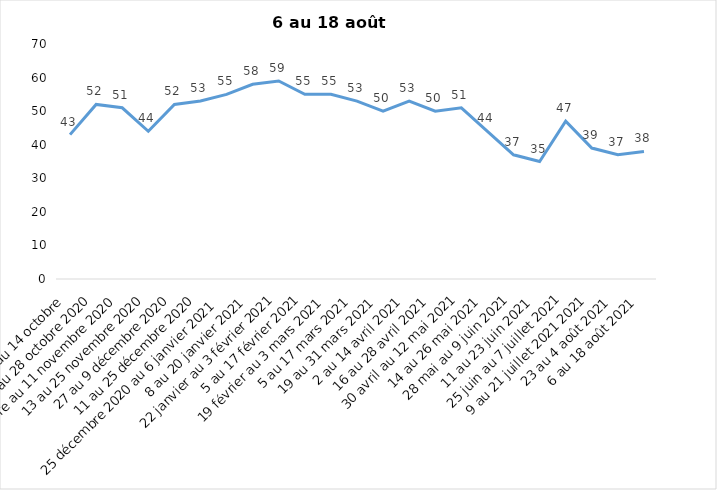
| Category | Toujours aux trois mesures |
|---|---|
| 2 au 14 octobre  | 43 |
| 16 au 28 octobre 2020 | 52 |
| 30 octobre au 11 novembre 2020 | 51 |
| 13 au 25 novembre 2020 | 44 |
| 27 au 9 décembre 2020 | 52 |
| 11 au 25 décembre 2020 | 53 |
| 25 décembre 2020 au 6 janvier 2021 | 55 |
| 8 au 20 janvier 2021 | 58 |
| 22 janvier au 3 février 2021 | 59 |
| 5 au 17 février 2021 | 55 |
| 19 février au 3 mars 2021 | 55 |
| 5 au 17 mars 2021 | 53 |
| 19 au 31 mars 2021 | 50 |
| 2 au 14 avril 2021 | 53 |
| 16 au 28 avril 2021 | 50 |
| 30 avril au 12 mai 2021 | 51 |
| 14 au 26 mai 2021 | 44 |
| 28 mai au 9 juin 2021 | 37 |
| 11 au 23 juin 2021 | 35 |
| 25 juin au 7 juillet 2021 | 47 |
| 9 au 21 juillet 2021 2021 | 39 |
| 23 au 4 août 2021 | 37 |
| 6 au 18 août 2021 | 38 |